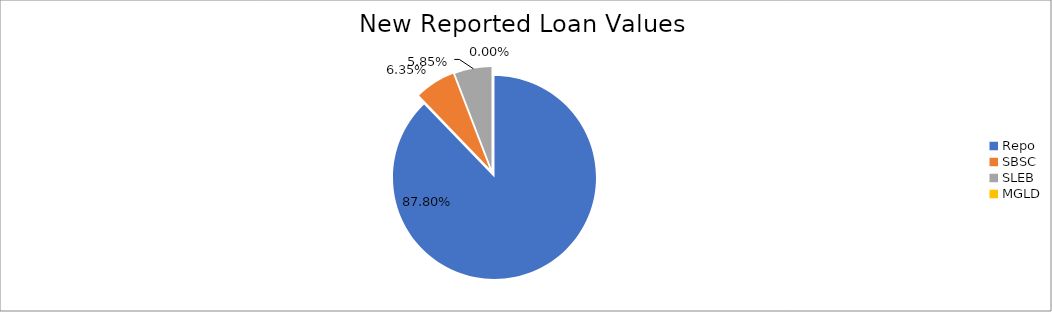
| Category | Series 0 |
|---|---|
| Repo | 8106201.313 |
| SBSC | 586364.644 |
| SLEB | 539644.723 |
| MGLD | 75.48 |